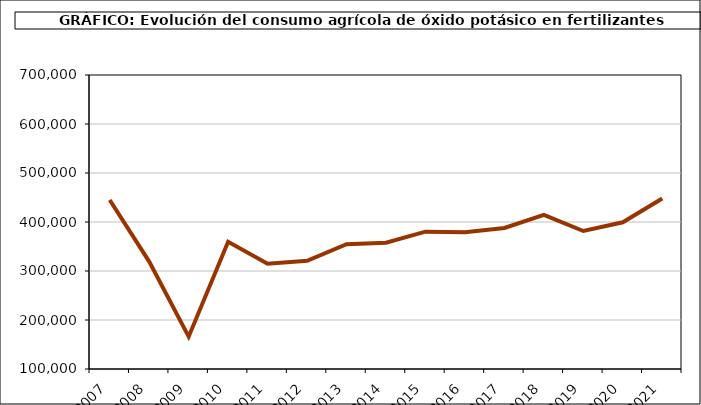
| Category | fertilizantes |
|---|---|
| 2007.0 | 444853 |
| 2008.0 | 319194 |
| 2009.0 | 166016 |
| 2010.0 | 359583 |
| 2011.0 | 314642 |
| 2012.0 | 320841 |
| 2013.0 | 354738 |
| 2014.0 | 357875 |
| 2015.0 | 380303 |
| 2016.0 | 379007 |
| 2017.0 | 387885 |
| 2018.0 | 414675 |
| 2019.0 | 381566 |
| 2020.0 | 399379 |
| 2021.0 | 447846 |